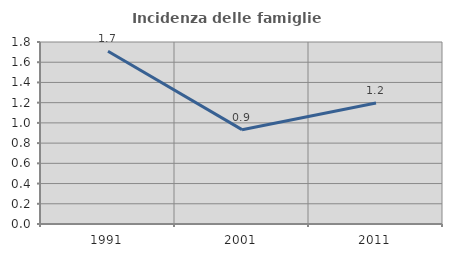
| Category | Incidenza delle famiglie numerose |
|---|---|
| 1991.0 | 1.709 |
| 2001.0 | 0.933 |
| 2011.0 | 1.196 |